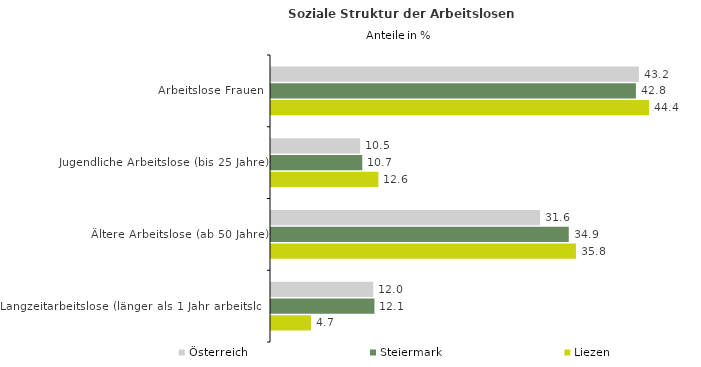
| Category | Österreich | Steiermark | Liezen |
|---|---|---|---|
| Arbeitslose Frauen | 43.18 | 42.833 | 44.37 |
| Jugendliche Arbeitslose (bis 25 Jahre) | 10.46 | 10.711 | 12.601 |
| Ältere Arbeitslose (ab 50 Jahre) | 31.584 | 34.947 | 35.791 |
| Langzeitarbeitslose (länger als 1 Jahr arbeitslos) | 11.999 | 12.142 | 4.692 |